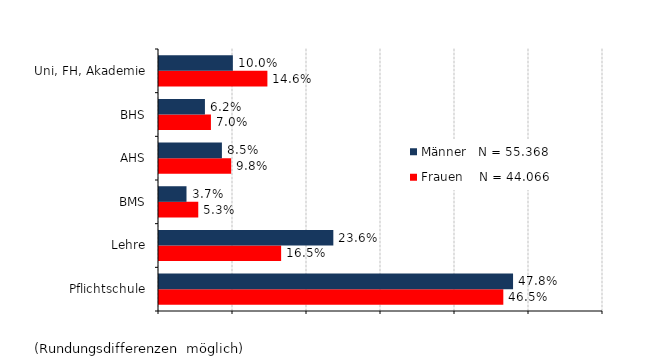
| Category | Frauen    N = 44.066 | Männer   N = 55.368 |
|---|---|---|
| Pflichtschule | 0.465 | 0.478 |
| Lehre | 0.165 | 0.236 |
| BMS | 0.053 | 0.037 |
| AHS | 0.098 | 0.085 |
| BHS | 0.07 | 0.062 |
| Uni, FH, Akademie | 0.146 | 0.1 |